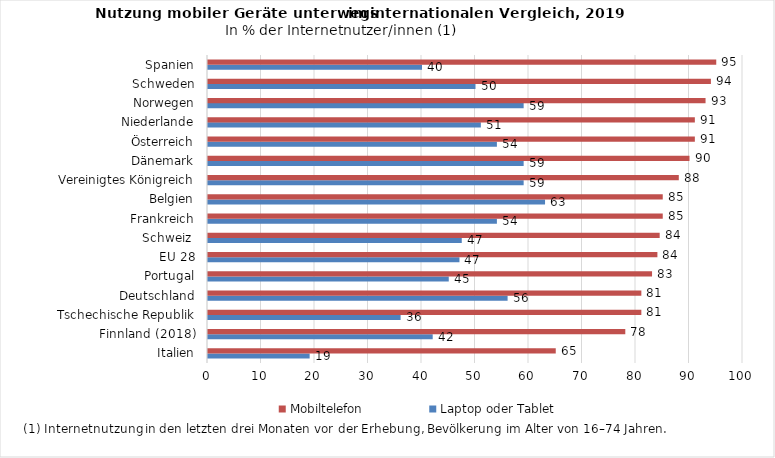
| Category | Laptop oder Tablet | Mobiltelefon |
|---|---|---|
| Italien | 19 | 65 |
| Finnland (2018) | 42 | 78 |
| Tschechische Republik | 36 | 81 |
| Deutschland | 56 | 81 |
| Portugal | 45 | 83 |
| EU 28 | 47 | 84 |
| Schweiz  | 47.432 | 84.427 |
| Frankreich | 54 | 85 |
| Belgien | 63 | 85 |
| Vereinigtes Königreich | 59 | 88 |
| Dänemark | 59 | 90 |
| Österreich | 54 | 91 |
| Niederlande | 51 | 91 |
| Norwegen | 59 | 93 |
| Schweden | 50 | 94 |
| Spanien | 40 | 95 |